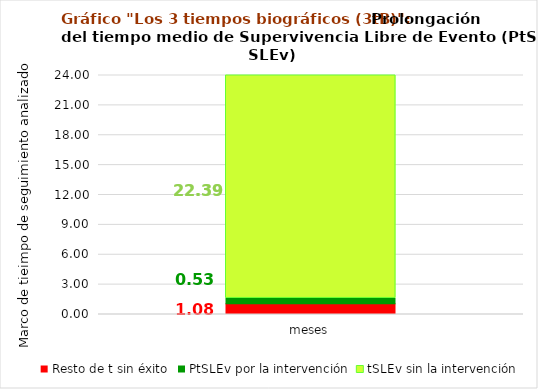
| Category | Resto de t sin éxito | PtSLEv por la intervención | tSLEv sin la intervención |
|---|---|---|---|
| meses | 1.076 | 0.535 | 22.389 |